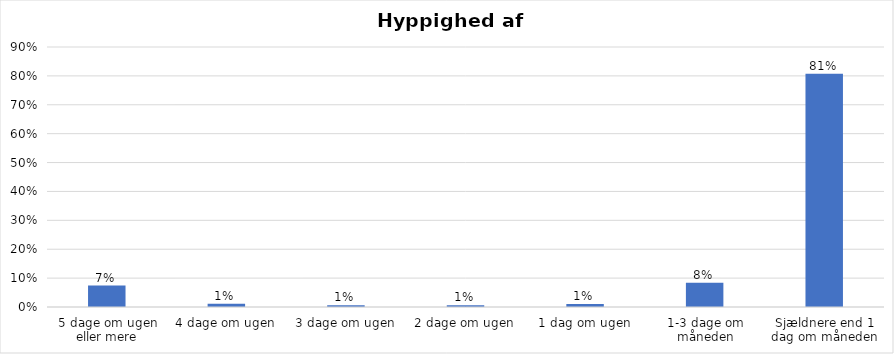
| Category | % |
|---|---|
| 5 dage om ugen eller mere | 0.074 |
| 4 dage om ugen | 0.011 |
| 3 dage om ugen | 0.006 |
| 2 dage om ugen | 0.006 |
| 1 dag om ugen | 0.01 |
| 1-3 dage om måneden | 0.084 |
| Sjældnere end 1 dag om måneden | 0.808 |